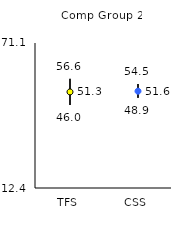
| Category | 25th | 75th | Mean |
|---|---|---|---|
| TFS | 46 | 56.6 | 51.29 |
| CSS | 48.9 | 54.5 | 51.59 |